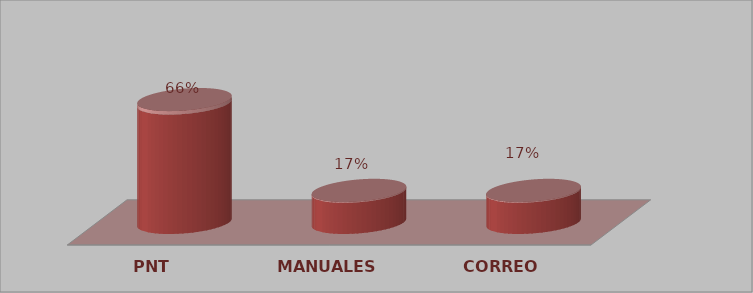
| Category | Series 0 | Series 1 |
|---|---|---|
| PNT | 23 | 0.657 |
| MANUALES | 6 | 0.171 |
| CORREO | 6 | 0.171 |